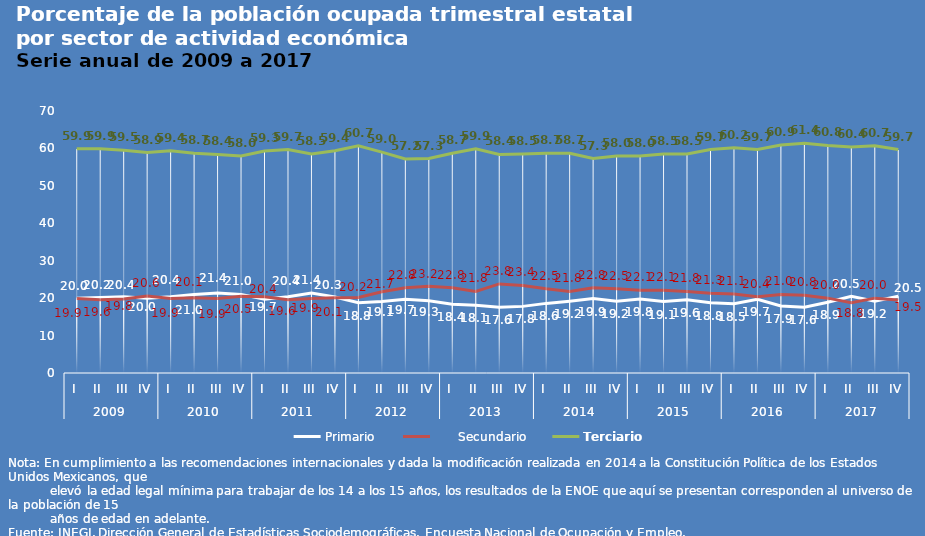
| Category | Primario |       Secundario | Terciario |
|---|---|---|---|
| 0 | 20 | 19.9 | 59.9 |
| 1 | 20.2 | 19.6 | 59.9 |
| 2 | 20.4 | 19.8 | 59.5 |
| 3 | 20 | 20.6 | 58.9 |
| 4 | 20.4 | 19.9 | 59.4 |
| 5 | 21 | 20.1 | 58.7 |
| 6 | 21.4 | 19.9 | 58.4 |
| 7 | 21 | 20.5 | 58 |
| 8 | 19.7 | 20.4 | 59.3 |
| 9 | 20.4 | 19.6 | 59.7 |
| 10 | 21.4 | 19.9 | 58.5 |
| 11 | 20.3 | 20.1 | 59.4 |
| 12 | 18.8 | 20.2 | 60.7 |
| 13 | 19.1 | 21.7 | 59 |
| 14 | 19.7 | 22.8 | 57.2 |
| 15 | 19.3 | 23.2 | 57.3 |
| 16 | 18.4 | 22.8 | 58.7 |
| 17 | 18.1 | 21.8 | 59.9 |
| 18 | 17.6 | 23.8 | 58.4 |
| 19 | 17.8 | 23.4 | 58.5 |
| 20 | 18.6 | 22.5 | 58.7 |
| 21 | 19.2 | 21.8 | 58.7 |
| 22 | 19.9 | 22.8 | 57.3 |
| 23 | 19.2 | 22.5 | 58 |
| 24 | 19.8 | 22.1 | 58 |
| 25 | 19.1 | 22.1 | 58.5 |
| 26 | 19.6 | 21.8 | 58.5 |
| 27 | 18.8 | 21.3 | 59.7 |
| 28 | 18.5 | 21.1 | 60.2 |
| 29 | 19.7 | 20.4 | 59.7 |
| 30 | 17.9 | 21 | 60.9 |
| 31 | 17.6 | 20.8 | 61.4 |
| 32 | 18.9 | 20 | 60.8 |
| 33 | 20.5 | 18.8 | 60.4 |
| 34 | 19.2 | 20 | 60.7 |
| 35 | 20.5 | 19.5 | 59.7 |